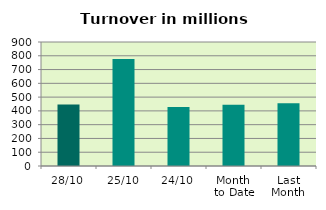
| Category | Series 0 |
|---|---|
| 28/10 | 446.828 |
| 25/10 | 777.363 |
| 24/10 | 428.158 |
| Month 
to Date | 445.366 |
| Last
Month | 454.566 |